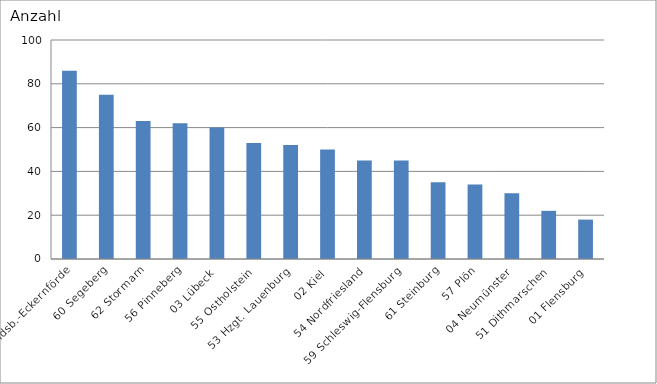
| Category | 58 Rendsb.-Eckernförde 60 Segeberg 62 Stormarn 56 Pinneberg 03 Lübeck 55 Ostholstein 53 Hzgt. Lauenburg 02 Kiel 54 Nordfriesland 59 Schleswig-Flensburg 61 Steinburg 57 Plön 04 Neumünster 51 Dithmarschen 01 Flensburg |
|---|---|
| 58 Rendsb.-Eckernförde | 86 |
| 60 Segeberg | 75 |
| 62 Stormarn | 63 |
| 56 Pinneberg | 62 |
| 03 Lübeck | 60 |
| 55 Ostholstein | 53 |
| 53 Hzgt. Lauenburg | 52 |
| 02 Kiel | 50 |
| 54 Nordfriesland | 45 |
| 59 Schleswig-Flensburg | 45 |
| 61 Steinburg | 35 |
| 57 Plön | 34 |
| 04 Neumünster | 30 |
| 51 Dithmarschen | 22 |
| 01 Flensburg | 18 |